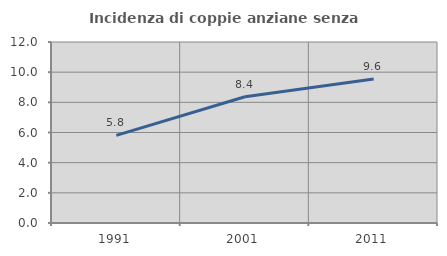
| Category | Incidenza di coppie anziane senza figli  |
|---|---|
| 1991.0 | 5.812 |
| 2001.0 | 8.367 |
| 2011.0 | 9.553 |